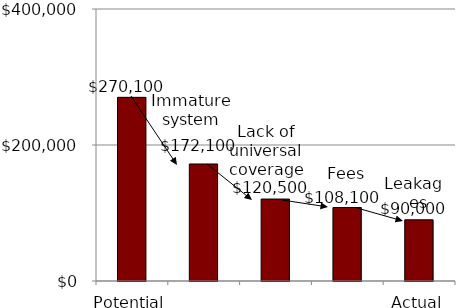
| Category | Series 0 |
|---|---|
| Potential | 270100 |
|  | 172100 |
|  | 120500 |
|  | 108100 |
| Actual | 90000 |